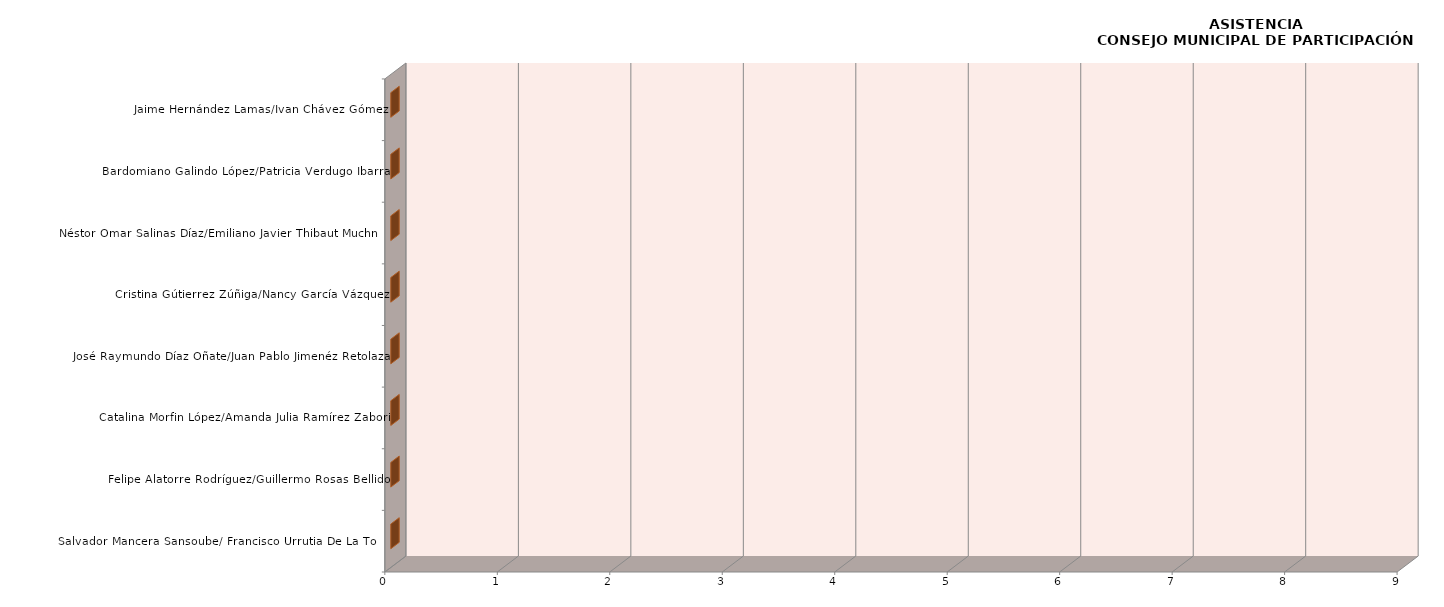
| Category | Series 0 |
|---|---|
| Salvador Mancera Sansoube/ Francisco Urrutia De La Torre | 0 |
| Felipe Alatorre Rodríguez/Guillermo Rosas Bellido | 0 |
| Catalina Morfin López/Amanda Julia Ramírez Zabori | 0 |
| José Raymundo Díaz Oñate/Juan Pablo Jimenéz Retolaza | 0 |
| Cristina Gútierrez Zúñiga/Nancy García Vázquez | 0 |
| Néstor Omar Salinas Díaz/Emiliano Javier Thibaut Muchnik  | 0 |
| Bardomiano Galindo López/Patricia Verdugo Ibarra | 0 |
| Jaime Hernández Lamas/Ivan Chávez Gómez | 0 |